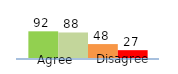
| Category | Series 0 | Series 1 | Series 2 | Series 3 |
|---|---|---|---|---|
| 0 | 92 | 88 | 48 | 27 |